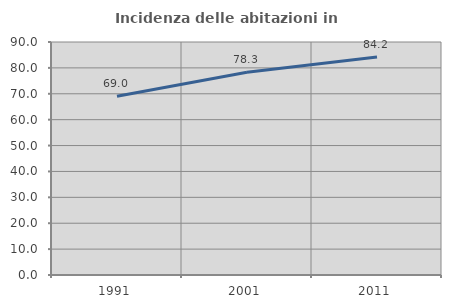
| Category | Incidenza delle abitazioni in proprietà  |
|---|---|
| 1991.0 | 69.012 |
| 2001.0 | 78.34 |
| 2011.0 | 84.233 |